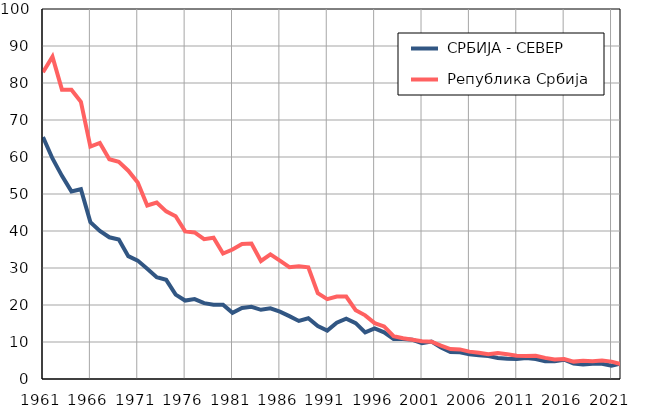
| Category |  СРБИЈА - СЕВЕР |  Република Србија |
|---|---|---|
| 1961.0 | 65.4 | 82.9 |
| 1962.0 | 59.6 | 87.1 |
| 1963.0 | 54.9 | 78.2 |
| 1964.0 | 50.7 | 78.2 |
| 1965.0 | 51.3 | 74.9 |
| 1966.0 | 42.4 | 62.8 |
| 1967.0 | 40 | 63.8 |
| 1968.0 | 38.3 | 59.4 |
| 1969.0 | 37.7 | 58.7 |
| 1970.0 | 33.2 | 56.3 |
| 1971.0 | 32 | 53.1 |
| 1972.0 | 29.8 | 46.9 |
| 1973.0 | 27.5 | 47.7 |
| 1974.0 | 26.8 | 45.3 |
| 1975.0 | 22.8 | 44 |
| 1976.0 | 21.2 | 39.9 |
| 1977.0 | 21.6 | 39.6 |
| 1978.0 | 20.5 | 37.8 |
| 1979.0 | 20.1 | 38.2 |
| 1980.0 | 20.1 | 33.9 |
| 1981.0 | 17.9 | 35 |
| 1982.0 | 19.2 | 36.5 |
| 1983.0 | 19.5 | 36.6 |
| 1984.0 | 18.7 | 31.9 |
| 1985.0 | 19.1 | 33.7 |
| 1986.0 | 18.2 | 32 |
| 1987.0 | 17 | 30.2 |
| 1988.0 | 15.7 | 30.5 |
| 1989.0 | 16.4 | 30.2 |
| 1990.0 | 14.3 | 23.2 |
| 1991.0 | 13.1 | 21.6 |
| 1992.0 | 15.2 | 22.3 |
| 1993.0 | 16.3 | 22.3 |
| 1994.0 | 15.1 | 18.6 |
| 1995.0 | 12.6 | 17.2 |
| 1996.0 | 13.7 | 15.1 |
| 1997.0 | 12.6 | 14.2 |
| 1998.0 | 10.8 | 11.6 |
| 1999.0 | 10.8 | 11 |
| 2000.0 | 10.6 | 10.6 |
| 2001.0 | 9.7 | 10.2 |
| 2002.0 | 10.1 | 10.1 |
| 2003.0 | 8.5 | 9 |
| 2004.0 | 7.3 | 8.1 |
| 2005.0 | 7.2 | 8 |
| 2006.0 | 6.7 | 7.4 |
| 2007.0 | 6.4 | 7.1 |
| 2008.0 | 6.2 | 6.7 |
| 2009.0 | 5.7 | 7 |
| 2010.0 | 5.5 | 6.7 |
| 2011.0 | 5.4 | 6.3 |
| 2012.0 | 5.7 | 6.2 |
| 2013.0 | 5.4 | 6.3 |
| 2014.0 | 4.8 | 5.7 |
| 2015.0 | 4.8 | 5.3 |
| 2016.0 | 5.2 | 5.4 |
| 2017.0 | 4.2 | 4.7 |
| 2018.0 | 3.9 | 4.9 |
| 2019.0 | 4.1 | 4.8 |
| 2020.0 | 4.1 | 5 |
| 2021.0 | 3.6 | 4.7 |
| 2022.0 | 4.2 | 4 |